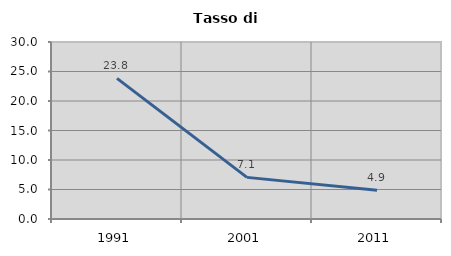
| Category | Tasso di disoccupazione   |
|---|---|
| 1991.0 | 23.827 |
| 2001.0 | 7.054 |
| 2011.0 | 4.889 |